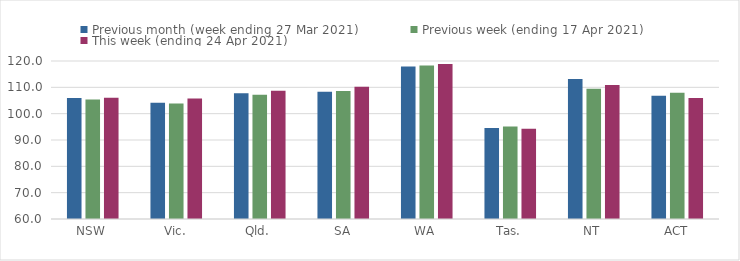
| Category | Previous month (week ending 27 Mar 2021) | Previous week (ending 17 Apr 2021) | This week (ending 24 Apr 2021) |
|---|---|---|---|
| NSW | 105.92 | 105.36 | 106.05 |
| Vic. | 104.19 | 103.89 | 105.79 |
| Qld. | 107.75 | 107.23 | 108.71 |
| SA | 108.34 | 108.59 | 110.22 |
| WA | 117.9 | 118.31 | 118.84 |
| Tas. | 94.58 | 95.1 | 94.31 |
| NT | 113.13 | 109.49 | 110.86 |
| ACT | 106.8 | 107.95 | 105.96 |